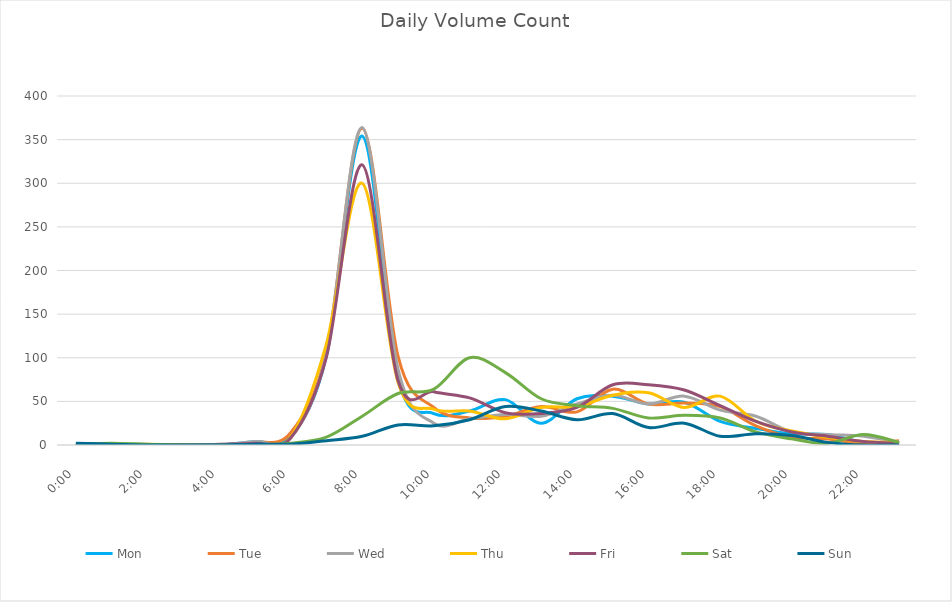
| Category | Mon | Tue | Wed | Thu | Fri | Sat | Sun |
|---|---|---|---|---|---|---|---|
| 0.0 | 0 | 1 | 0 | 0 | 0 | 1 | 2 |
| 0.0416666666666667 | 0 | 0 | 1 | 0 | 1 | 2 | 1 |
| 0.0833333333333333 | 0 | 0 | 0 | 1 | 0 | 1 | 0 |
| 0.125 | 0 | 0 | 0 | 0 | 0 | 0 | 0 |
| 0.166666666666667 | 0 | 0 | 0 | 0 | 1 | 0 | 0 |
| 0.208333333333333 | 4 | 3 | 4 | 1 | 2 | 0 | 1 |
| 0.25 | 10 | 14 | 8 | 9 | 8 | 2 | 1 |
| 0.291666666666667 | 102 | 107 | 105 | 116 | 101 | 9 | 5 |
| 0.333333333333333 | 354 | 363 | 364 | 300 | 321 | 33 | 10 |
| 0.375 | 76 | 102 | 87 | 72 | 74 | 59 | 23 |
| 0.416666666666667 | 36 | 43 | 25 | 41 | 61 | 64 | 22 |
| 0.458333333333333 | 39 | 31 | 30 | 39 | 54 | 100 | 29 |
| 0.5 | 52 | 33 | 35 | 30 | 37 | 83 | 44 |
| 0.541666666666667 | 25 | 44 | 33 | 43 | 36 | 53 | 39 |
| 0.583333333333333 | 53 | 38 | 47 | 44 | 43 | 45 | 29 |
| 0.625 | 56 | 64 | 57 | 57 | 69 | 42 | 36 |
| 0.666666666666667 | 47 | 47 | 47 | 60 | 69 | 31 | 20 |
| 0.708333333333333 | 49 | 48 | 56 | 43 | 63 | 34 | 25 |
| 0.75 | 27 | 44 | 40 | 56 | 45 | 31 | 10 |
| 0.791666666666667 | 19 | 22 | 33 | 27 | 27 | 15 | 13 |
| 0.833333333333333 | 13 | 9 | 15 | 16 | 15 | 7 | 11 |
| 0.875 | 12 | 7 | 12 | 9 | 10 | 2 | 3 |
| 0.916666666666667 | 3 | 2 | 10 | 4 | 4 | 12 | 0 |
| 0.958333333333333 | 2 | 5 | 3 | 3 | 2 | 3 | 0 |